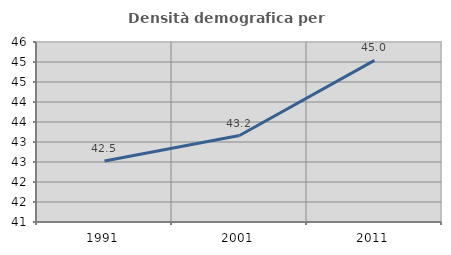
| Category | Densità demografica |
|---|---|
| 1991.0 | 42.526 |
| 2001.0 | 43.161 |
| 2011.0 | 45.041 |